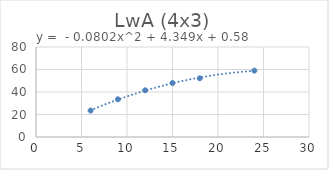
| Category | Series 0 |
|---|---|
| 6.0 | 23.5 |
| 9.0 | 33.5 |
| 12.0 | 41.5 |
| 15.0 | 48 |
| 18.0 | 52.2 |
| 24.0 | 59 |